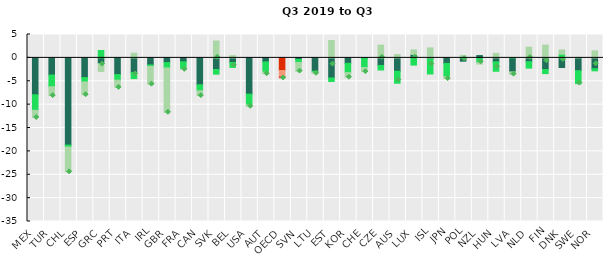
| Category | Joblessness (net of population change) | Hours per at work employees | 0 hours employment |
|---|---|---|---|
| MEX | -7.89 | -3.318 | -1.549 |
| TUR | -3.67 | -2.507 | -1.894 |
| CHL | -18.654 | -0.418 | -5.314 |
| ESP | -4.208 | -0.937 | -2.735 |
| GRC | -1.219 | 1.572 | -1.68 |
| PRT | -3.569 | -1.198 | -1.543 |
| ITA | -3.139 | -1.302 | 0.989 |
| IRL | -1.509 | -0.307 | -3.806 |
| GBR | -0.997 | -1.152 | -9.505 |
| FRA | -0.839 | -1.546 | -0.071 |
| CAN | -5.755 | -1.288 | -1.029 |
| SVK | -2.488 | -0.994 | 3.609 |
| BEL | -0.979 | -1.063 | 0.478 |
| USA | -7.756 | -2.318 | -0.294 |
| AUT | -0.86 | -2.191 | -0.345 |
| OECD | -2.706 | -1.272 | -0.314 |
| SVN | -0.327 | -0.667 | -1.839 |
| LTU | -2.86 | -0.23 | -0.207 |
| EST | -4.299 | -0.749 | 3.719 |
| KOR | -1.168 | -1.987 | -0.99 |
| CHE | -0.153 | -1.911 | -0.879 |
| CZE | -1.618 | -0.974 | 2.717 |
| AUS | -2.856 | -2.571 | 0.71 |
| LUX | 0.72 | -1.549 | 0.976 |
| ISL | -0.233 | -3.212 | 2.13 |
| JPN | -1.188 | -2.841 | -0.411 |
| POL | -0.709 | 0.127 | 0.398 |
| NZL | 0.498 | -0.996 | -0.34 |
| HUN | -0.843 | -2.02 | 0.972 |
| LVA | -2.998 | 0.031 | -0.515 |
| NLD | -0.813 | -1.385 | 2.288 |
| FIN | -2.485 | -0.879 | 2.732 |
| DNK | -2.065 | 0.777 | 0.928 |
| SWE | -2.746 | -2.772 | 0.118 |
| NOR | -2.317 | -0.456 | 1.503 |